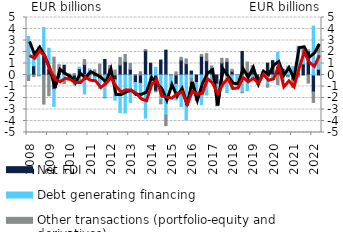
| Category | Net FDI | Debt generating financing | Other transactions (portfolio-equity and derivatives) |
|---|---|---|---|
| 2008.0 | -0.033 | 3.349 | -0.445 |
| 2008.0 | 0.803 | 1.088 | -0.143 |
| 2008.0 | -0.018 | 2.453 | -0.057 |
| 2008.0 | 1.693 | 2.442 | -2.531 |
| 2009.0 | 0.563 | 1.76 | -1.808 |
| 2009.0 | -1.245 | -1.481 | 1.555 |
| 2009.0 | 0.091 | -0.441 | 0.803 |
| 2009.0 | 0.849 | -0.524 | -0.23 |
| 2010.0 | -0.209 | 0.064 | 0.002 |
| 2010.0 | -0.422 | -0.45 | 0.129 |
| 2010.0 | 0.55 | 0.133 | -0.583 |
| 2010.0 | 0.916 | -1.641 | 0.426 |
| 2011.0 | 0.212 | 0.326 | -0.276 |
| 2011.0 | -0.157 | -0.266 | 0.447 |
| 2011.0 | -0.329 | -0.835 | 0.948 |
| 2011.0 | 1.349 | -1.961 | -0.027 |
| 2012.0 | 0.56 | -0.353 | 0.275 |
| 2012.0 | -0.417 | -1.763 | 0.435 |
| 2012.0 | 0.874 | -3.272 | 0.657 |
| 2012.0 | 1.166 | -3.304 | 0.621 |
| 2013.0 | 0.497 | -2.385 | 0.521 |
| 2013.0 | -0.651 | -1.108 | 0.016 |
| 2013.0 | -0.73 | -1.279 | 0.283 |
| 2013.0 | 2.115 | -3.746 | 0.106 |
| 2014.0 | 1.023 | -0.891 | -0.381 |
| 2014.0 | -1.403 | 0.662 | -0.06 |
| 2014.0 | 1.296 | -2.179 | -0.328 |
| 2014.0 | 2.162 | -3.495 | -0.903 |
| 2015.0 | -0.029 | -0.895 | 0.05 |
| 2015.0 | -0.806 | -1.363 | 0.273 |
| 2015.0 | 1.293 | -2.748 | 0.242 |
| 2015.0 | 0.981 | -3.918 | 0.413 |
| 2016.0 | 0.34 | -0.282 | -0.707 |
| 2016.0 | -0.651 | -1.305 | -0.283 |
| 2016.0 | 1.63 | -2.575 | 0.164 |
| 2016.0 | 1.244 | -1.739 | 0.616 |
| 2017.0 | 0.616 | -0.382 | 0.171 |
| 2017.0 | -0.797 | -1.326 | -0.56 |
| 2017.0 | 1.054 | -0.941 | 0.4 |
| 2017.0 | 1.164 | -1.523 | 0.258 |
| 2018.0 | 0.329 | -1.244 | 0.168 |
| 2018.0 | 0 | -0.633 | -0.193 |
| 2018.0 | 2.05 | -1.506 | -0.041 |
| 2018.0 | 0.233 | -1.376 | 0.896 |
| 2019.0 | 0.522 | -0.205 | 0.3 |
| 2019.0 | -0.551 | -0.023 | -0.247 |
| 2019.0 | 0.124 | 0.141 | 0.021 |
| 2019.0 | 1.034 | -0.821 | -0.234 |
| 2020.0 | 1.249 | -0.343 | -0.1 |
| 2020.0 | 0.723 | 1.241 | -0.836 |
| 2020.0 | 0.505 | -0.433 | -0.134 |
| 2020.0 | -0.117 | 0.762 | -0.046 |
| 2021.0 | -0.439 | 0.732 | -0.631 |
| 2021.0 | 0.196 | 2.305 | -0.172 |
| 2021.0 | 0.969 | 1.016 | 0.425 |
| 2021.0 | 2.107 | 0.102 | -0.703 |
| 2022.0 | -1.476 | 4.251 | -0.905 |
| 2022.0 | 0.503 | 1.483 | 0.676 |